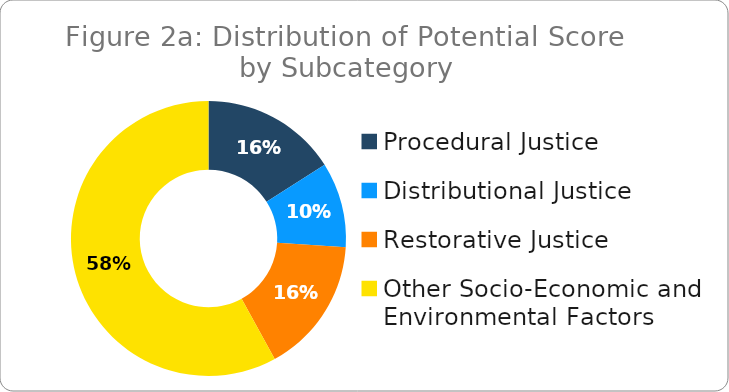
| Category | Series 0 |
|---|---|
| Procedural Justice | 8 |
| Distributional Justice | 5 |
| Restorative Justice | 8 |
| Other Socio-Economic and Environmental Factors | 29 |